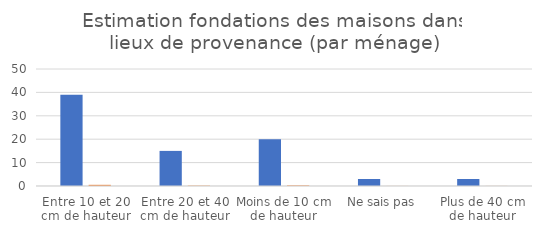
| Category | Quartiers | Estimation ménages déplacés |
|---|---|---|
| Entre 10 et 20 cm de hauteur | 39 | 0.506 |
| Entre 20 et 40 cm de hauteur | 15 | 0.166 |
| Moins de 10 cm de hauteur | 20 | 0.266 |
| Ne sais pas | 3 | 0.03 |
| Plus de 40 cm de hauteur | 3 | 0.033 |